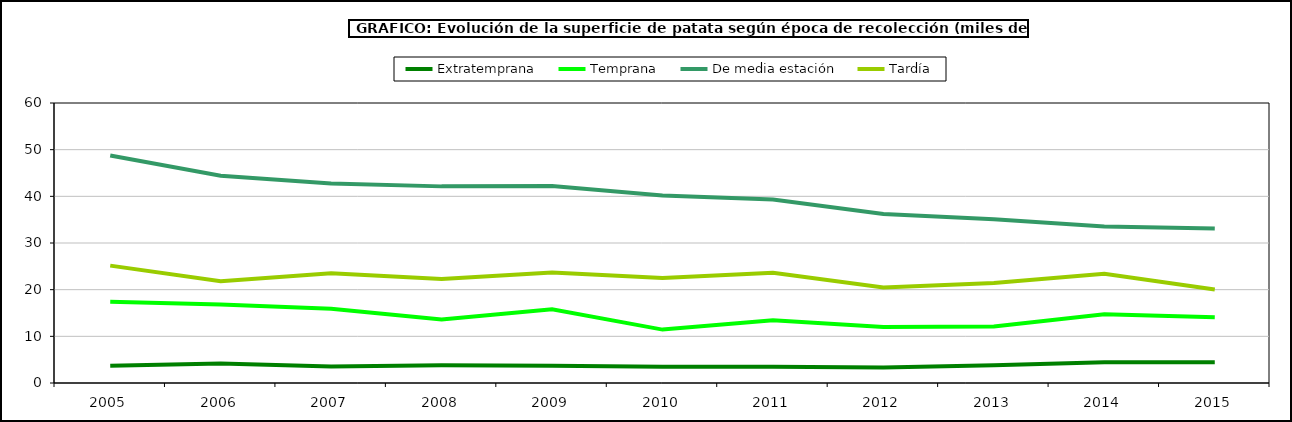
| Category | Extratemprana | Temprana | De media estación | Tardía |
|---|---|---|---|---|
| 2005.0 | 3.674 | 17.435 | 48.734 | 25.155 |
| 2006.0 | 4.16 | 16.814 | 44.395 | 21.83 |
| 2007.0 | 3.542 | 15.925 | 42.735 | 23.526 |
| 2008.0 | 3.784 | 13.629 | 42.134 | 22.278 |
| 2009.0 | 3.713 | 15.804 | 42.188 | 23.661 |
| 2010.0 | 3.488 | 11.444 | 40.198 | 22.492 |
| 2011.0 | 3.471 | 13.439 | 39.332 | 23.623 |
| 2012.0 | 3.309 | 12.004 | 36.224 | 20.486 |
| 2013.0 | 3.821 | 12.091 | 35.096 | 21.424 |
| 2014.0 | 4.468 | 14.725 | 33.547 | 23.388 |
| 2015.0 | 4.465 | 14.085 | 33.109 | 20.017 |